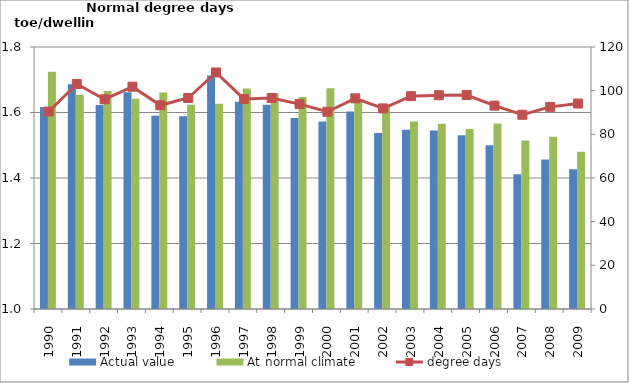
| Category | Actual value | At normal climate |
|---|---|---|
| 1990.0 | 1.617 | 1.725 |
| 1991.0 | 1.687 | 1.654 |
| 1992.0 | 1.623 | 1.666 |
| 1993.0 | 1.662 | 1.642 |
| 1994.0 | 1.59 | 1.661 |
| 1995.0 | 1.588 | 1.623 |
| 1996.0 | 1.713 | 1.626 |
| 1997.0 | 1.633 | 1.674 |
| 1998.0 | 1.623 | 1.659 |
| 1999.0 | 1.583 | 1.647 |
| 2000.0 | 1.572 | 1.674 |
| 2001.0 | 1.603 | 1.639 |
| 2002.0 | 1.537 | 1.62 |
| 2003.0 | 1.547 | 1.572 |
| 2004.0 | 1.545 | 1.566 |
| 2005.0 | 1.531 | 1.55 |
| 2006.0 | 1.5 | 1.566 |
| 2007.0 | 1.412 | 1.514 |
| 2008.0 | 1.457 | 1.526 |
| 2009.0 | 1.427 | 1.48 |